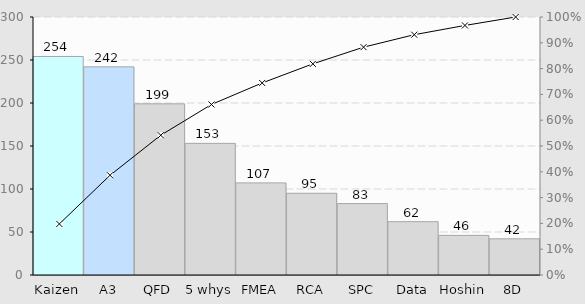
| Category | Ordered totals |
|---|---|
| Kaizen | 254.1 |
| A3 | 242.02 |
| QFD | 199.03 |
| 5 whys | 153.07 |
| FMEA | 107.09 |
| RCA | 95.04 |
| SPC | 83.05 |
| Data | 62.01 |
| Hoshin | 46.06 |
| 8D | 42.08 |